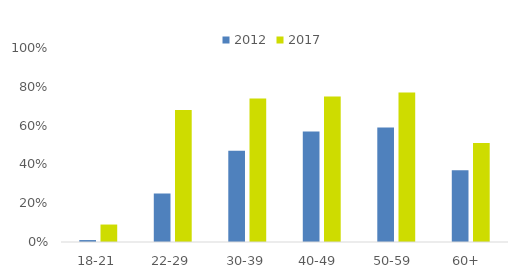
| Category | 2012 | 2017 |
|---|---|---|
| 18-21 | 0.01 | 0.09 |
| 22-29 | 0.25 | 0.68 |
| 30-39 | 0.47 | 0.74 |
| 40-49  | 0.57 | 0.75 |
| 50-59  | 0.59 | 0.77 |
| 60+  | 0.37 | 0.51 |